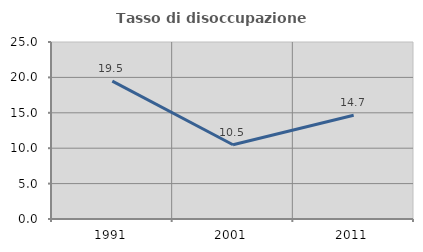
| Category | Tasso di disoccupazione giovanile  |
|---|---|
| 1991.0 | 19.469 |
| 2001.0 | 10.49 |
| 2011.0 | 14.655 |